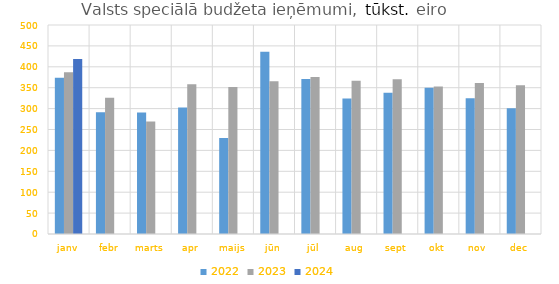
| Category | 2022 | 2023 | 2024 |
|---|---|---|---|
| janv | 373920.799 | 386755.586 | 418920.08 |
| febr | 291303.596 | 325763.822 | 0 |
| marts | 290859.027 | 269347.904 | 0 |
| apr | 302459.796 | 358546.386 | 0 |
| maijs | 229777.32 | 351917.303 | 0 |
| jūn | 435953.091 | 365282.092 | 0 |
| jūl | 370694.27 | 375551.062 | 0 |
| aug | 324382.079 | 366816.511 | 0 |
| sept | 337952.536 | 370049.791 | 0 |
| okt | 349920.822 | 352599.457 | 0 |
| nov | 324970.324 | 361097.134 | 0 |
| dec | 300963.059 | 355952.142 | 0 |